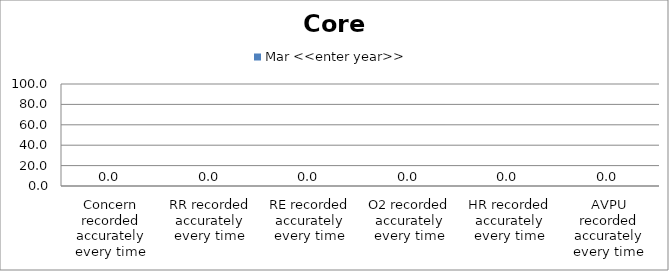
| Category | Mar <<enter year>> |
|---|---|
| Concern recorded accurately every time | 0 |
| RR recorded accurately every time | 0 |
| RE recorded accurately every time | 0 |
| O2 recorded accurately every time | 0 |
| HR recorded accurately every time | 0 |
| AVPU recorded accurately every time | 0 |